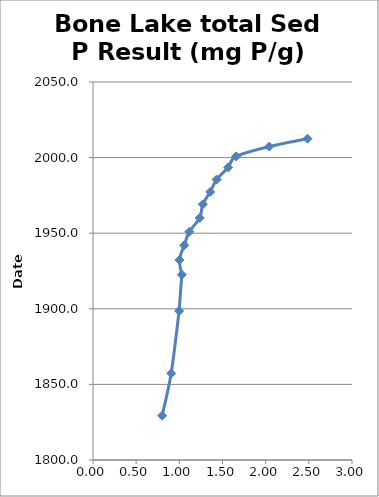
| Category | total Sed P Result (mg P/g) |
|---|---|
| 2.4845264638534204 | 2012.5 |
| 2.041970721111602 | 2007.3 |
| 1.6580548916150188 | 2000.8 |
| 1.5657532277324147 | 1993.5 |
| 1.4322158727325423 | 1985.5 |
| 1.3575231027230257 | 1977.3 |
| 1.271763214362188 | 1969.1 |
| 1.2359805634810737 | 1960.1 |
| 1.115954041706626 | 1951 |
| 1.0561938106887503 | 1942 |
| 1.001651966298477 | 1932.3 |
| 1.028884868271874 | 1922.6 |
| 0.9976578413059107 | 1898.6 |
| 0.9054106558848444 | 1857.3 |
| 0.8008734571422348 | 1829.3 |